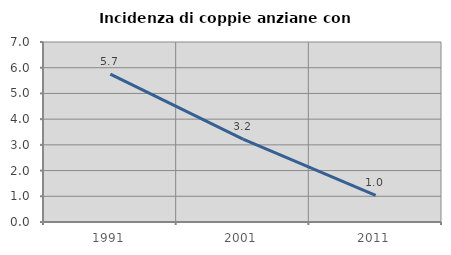
| Category | Incidenza di coppie anziane con figli |
|---|---|
| 1991.0 | 5.747 |
| 2001.0 | 3.226 |
| 2011.0 | 1.031 |